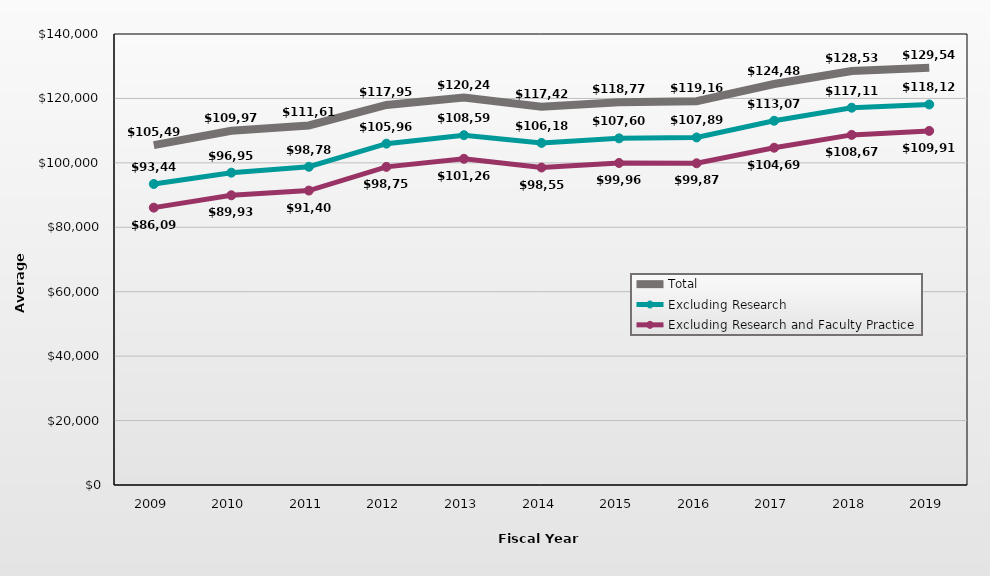
| Category | Total | Excluding Research | Excluding Research and Faculty Practice |
|---|---|---|---|
| 2009.0 | 105496 | 93445 | 86096 |
| 2010.0 | 109974 | 96955 | 89933 |
| 2011.0 | 111613 | 98786 | 91402 |
| 2012.0 | 117959 | 105962 | 98752 |
| 2013.0 | 120248 | 108596 | 101261 |
| 2014.0 | 117425 | 106187 | 98550 |
| 2015.0 | 118778 | 107606 | 99966 |
| 2016.0 | 119160 | 107892 | 99873 |
| 2017.0 | 124487 | 113070 | 104698 |
| 2018.0 | 128535 | 117119 | 108679 |
| 2019.0 | 129549 | 118124 | 109912 |